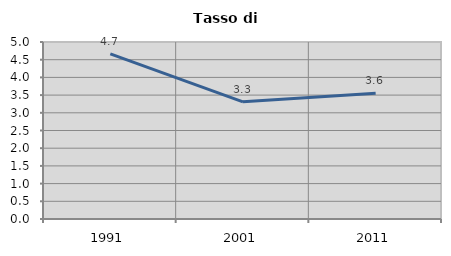
| Category | Tasso di disoccupazione   |
|---|---|
| 1991.0 | 4.664 |
| 2001.0 | 3.309 |
| 2011.0 | 3.553 |